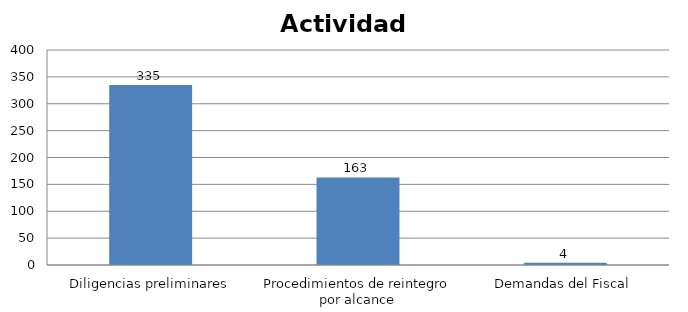
| Category | Series 0 |
|---|---|
| Diligencias preliminares | 335 |
| Procedimientos de reintegro por alcance | 163 |
| Demandas del Fiscal | 4 |